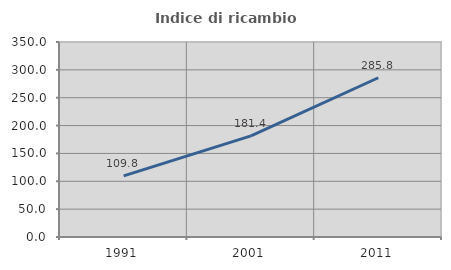
| Category | Indice di ricambio occupazionale  |
|---|---|
| 1991.0 | 109.773 |
| 2001.0 | 181.425 |
| 2011.0 | 285.843 |